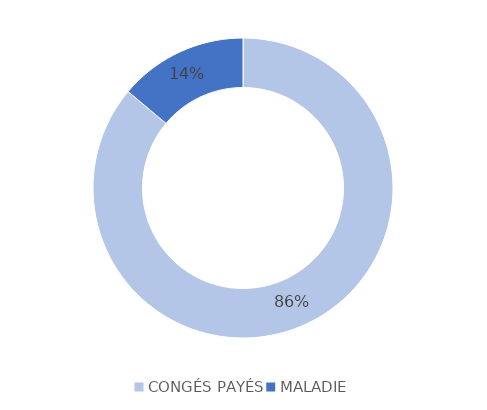
| Category | Series 0 |
|---|---|
| CONGÉS PAYÉS | 31 |
| MALADIE | 5 |